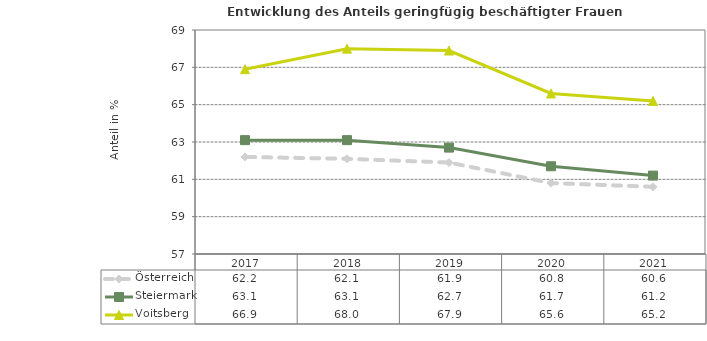
| Category | Österreich | Steiermark | Voitsberg |
|---|---|---|---|
| 2021.0 | 60.6 | 61.2 | 65.2 |
| 2020.0 | 60.8 | 61.7 | 65.6 |
| 2019.0 | 61.9 | 62.7 | 67.9 |
| 2018.0 | 62.1 | 63.1 | 68 |
| 2017.0 | 62.2 | 63.1 | 66.9 |